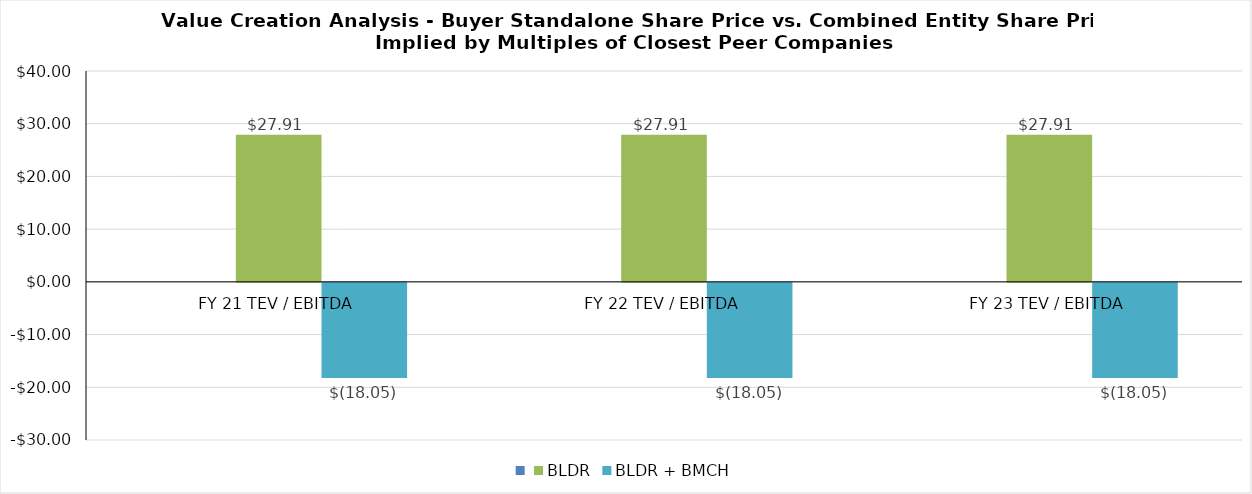
| Category | Series 0 | BLDR | BLDR + BMCH |
|---|---|---|---|
| FY 21 TEV / EBITDA |  | 27.91 | -18.046 |
| FY 22 TEV / EBITDA |  | 27.91 | -18.046 |
| FY 23 TEV / EBITDA |  | 27.91 | -18.046 |